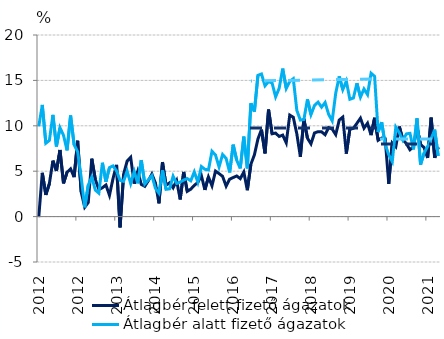
| Category | Átlagbér felett fizető ágazatok | Átlagbér alatt fizető ágazatok |
|---|---|---|
| 2012-01-01 | -0.058 | 9.93 |
| 2012-02-01 | 4.823 | 12.297 |
| 2012-03-01 | 2.388 | 8.082 |
| 2012-04-01 | 3.629 | 8.388 |
| 2012-05-01 | 6.165 | 11.205 |
| 2012-06-01 | 5.031 | 7.723 |
| 2012-07-01 | 7.335 | 9.793 |
| 2012-08-01 | 3.662 | 8.954 |
| 2012-09-01 | 4.878 | 7.299 |
| 2012-10-01 | 5.257 | 11.133 |
| 2012-11-01 | 4.346 | 7.911 |
| 2012-12-01 | 8.354 | 7.139 |
| 2013-01-01 | 2.71 | 4.326 |
| 2013-02-01 | 1.036 | 1.019 |
| 2013-03-01 | 1.551 | 3.471 |
| 2013-04-01 | 6.378 | 4.361 |
| 2013-05-01 | 4.083 | 2.913 |
| 2013-06-01 | 2.984 | 2.583 |
| 2013-07-01 | 3.183 | 5.929 |
| 2013-08-01 | 3.481 | 3.84 |
| 2013-09-01 | 2.351 | 5.4 |
| 2013-10-01 | 4.181 | 5.586 |
| 2013-11-01 | 5.695 | 5.036 |
| 2013-12-01 | -1.186 | 3.997 |
| 2014-01-01 | 4.653 | 3.886 |
| 2014-02-01 | 6.111 | 5.011 |
| 2014-03-01 | 6.53 | 3.639 |
| 2014-04-01 | 3.629 | 4.971 |
| 2014-05-01 | 4.977 | 3.664 |
| 2014-06-01 | 3.547 | 6.227 |
| 2014-07-01 | 3.336 | 3.594 |
| 2014-08-01 | 3.954 | 4.055 |
| 2014-09-01 | 4.686 | 4.519 |
| 2014-10-01 | 3.699 | 3.111 |
| 2014-11-01 | 1.464 | 2.589 |
| 2014-12-01 | 6.005 | 5.104 |
| 2015-01-01 | 3.452 | 3.003 |
| 2015-02-01 | 3.717 | 3.056 |
| 2015-03-01 | 3.172 | 4.449 |
| 2015-04-01 | 3.968 | 3.646 |
| 2015-05-01 | 1.889 | 3.801 |
| 2015-06-01 | 4.92 | 4.022 |
| 2015-07-01 | 2.785 | 4.187 |
| 2015-08-01 | 3.023 | 3.943 |
| 2015-09-01 | 3.441 | 4.918 |
| 2015-10-01 | 3.756 | 3.789 |
| 2015-11-01 | 4.514 | 5.516 |
| 2015-12-01 | 2.94 | 5.209 |
| 2016-01-01 | 4.364 | 5.144 |
| 2016-02-01 | 3.395 | 7.196 |
| 2016-03-01 | 5.013 | 6.775 |
| 2016-04-01 | 4.739 | 5.467 |
| 2016-05-01 | 4.433 | 6.839 |
| 2016-06-01 | 3.358 | 6.412 |
| 2016-07-01 | 4.124 | 4.861 |
| 2016-08-01 | 4.304 | 7.919 |
| 2016-09-01 | 4.474 | 6.199 |
| 2016-10-01 | 4.179 | 5.302 |
| 2016-11-01 | 4.908 | 8.801 |
| 2016-12-01 | 2.906 | 5.304 |
| 2017-01-01 | 5.755 | 12.482 |
| 2017-02-01 | 6.804 | 11.562 |
| 2017-03-01 | 8.549 | 15.561 |
| 2017-04-01 | 9.578 | 15.705 |
| 2017-05-01 | 6.958 | 14.407 |
| 2017-06-01 | 11.791 | 14.866 |
| 2017-07-01 | 9.124 | 14.713 |
| 2017-08-01 | 9.197 | 13.189 |
| 2017-09-01 | 8.828 | 14.124 |
| 2017-10-01 | 8.975 | 16.299 |
| 2017-11-01 | 8.13 | 14.121 |
| 2017-12-01 | 11.18 | 14.889 |
| 2018-01-01 | 10.939 | 15.186 |
| 2018-02-01 | 9.113 | 11.702 |
| 2018-03-01 | 6.593 | 10.629 |
| 2018-04-01 | 10.763 | 10.693 |
| 2018-05-01 | 8.641 | 12.911 |
| 2018-06-01 | 8.013 | 11.233 |
| 2018-07-01 | 9.213 | 12.241 |
| 2018-08-01 | 9.35 | 12.607 |
| 2018-09-01 | 9.338 | 12.05 |
| 2018-10-01 | 9.018 | 12.565 |
| 2018-11-01 | 9.804 | 11.262 |
| 2018-12-01 | 9.641 | 10.546 |
| 2019-01-01 | 9.033 | 13.586 |
| 2019-02-01 | 10.637 | 15.444 |
| 2019-03-01 | 10.957 | 13.985 |
| 2019-04-01 | 6.936 | 14.921 |
| 2019-05-01 | 9.624 | 12.925 |
| 2019-06-01 | 9.717 | 13.059 |
| 2019-07-01 | 10.274 | 14.69 |
| 2019-08-01 | 10.838 | 13.158 |
| 2019-09-01 | 9.738 | 14.058 |
| 2019-10-01 | 10.284 | 13.437 |
| 2019-11-01 | 8.973 | 15.79 |
| 2019-12-01 | 10.88 | 15.445 |
| 2020-01-01 | 8.408 | 9.321 |
| 2020-02-01 | 8.659 | 10.399 |
| 2020-03-01 | 8.582 | 7.942 |
| 2020-04-01 | 3.6 | 6.812 |
| 2020-05-01 | 8.114 | 6.056 |
| 2020-06-01 | 7.701 | 9.858 |
| 2020-07-01 | 9.917 | 9.225 |
| 2020-08-01 | 8.468 | 8.407 |
| 2020-09-01 | 8.035 | 9.112 |
| 2020-10-01 | 7.358 | 9.171 |
| 2020-11-01 | 7.701 | 7.397 |
| 2020-12-01 | 9.837 | 10.814 |
| 2021-01-01 | 7.947 | 5.718 |
| 2021-02-01 | 7.601 | 7.003 |
| 2021-03-01 | 6.458 | 7.723 |
| 2021-04-01 | 10.887 | 8.573 |
| 2021-05-01 | 6.48 | 9.581 |
| 2021-06-01 | 7.628 | 6.685 |